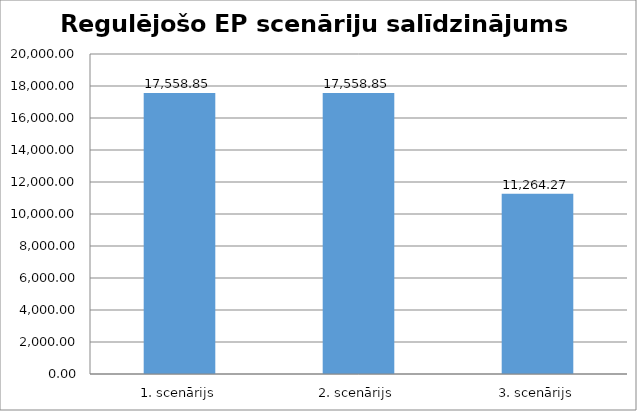
| Category | 1. scenārijs |
|---|---|
| 1. scenārijs | 17558.851 |
| 2. scenārijs | 17558.851 |
| 3. scenārijs | 11264.274 |